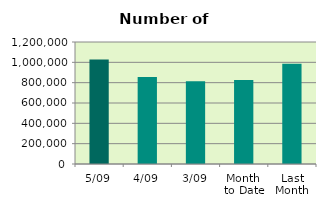
| Category | Series 0 |
|---|---|
| 5/09 | 1029078 |
| 4/09 | 855746 |
| 3/09 | 814736 |
| Month 
to Date | 825990 |
| Last
Month | 986270.455 |